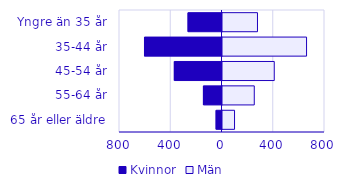
| Category | Kvinnor | Män |
|---|---|---|
| 0 | -265 | 273 |
| 1 | -605 | 656 |
| 2 | -372 | 404 |
| 3 | -145 | 248 |
| 4 | -46 | 94 |